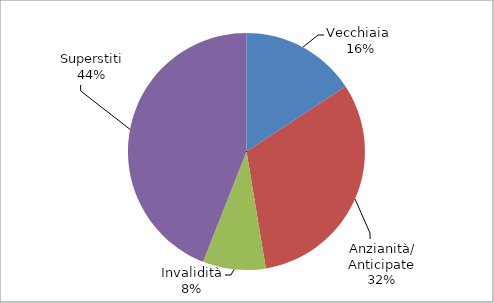
| Category | Series 0 |
|---|---|
| Vecchiaia  | 10339 |
| Anzianità/ Anticipate | 20764 |
| Invalidità | 5636 |
| Superstiti | 28896 |